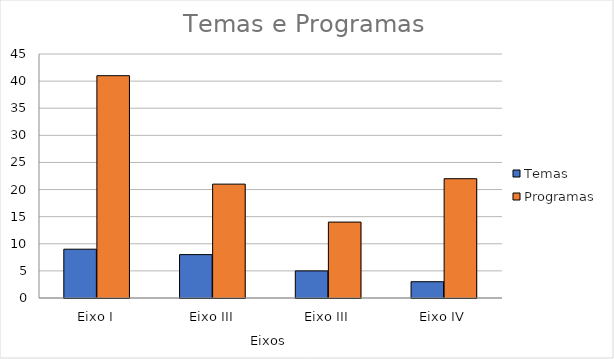
| Category | Temas | Programas |
|---|---|---|
| Eixo I | 9 | 41 |
| Eixo III | 8 | 21 |
| Eixo III | 5 | 14 |
| Eixo IV | 3 | 22 |